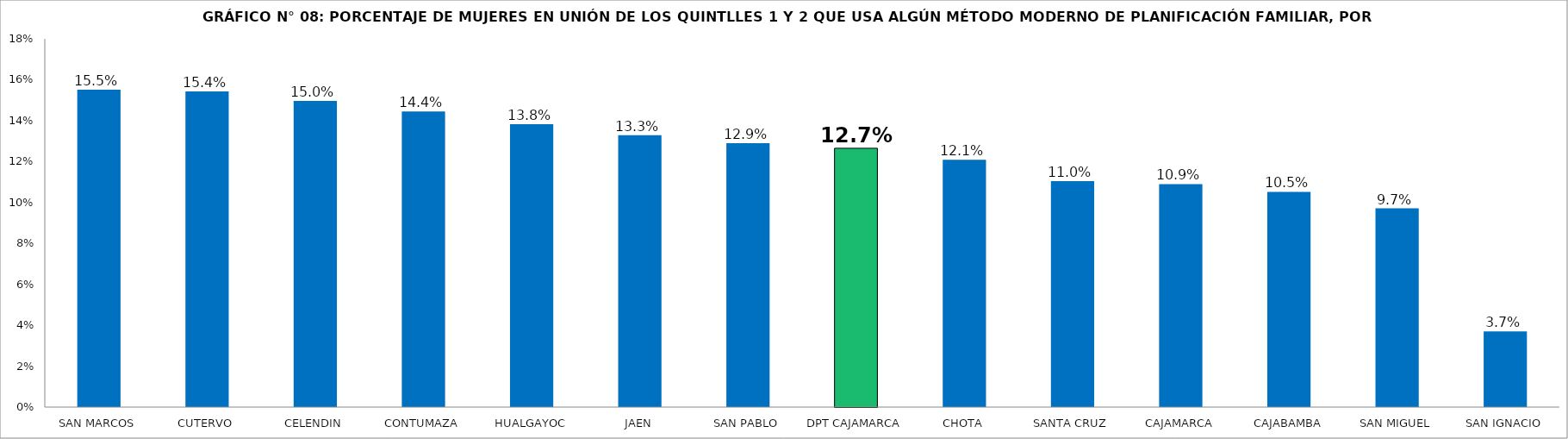
| Category | Series 0 |
|---|---|
| SAN MARCOS | 0.155 |
| CUTERVO | 0.154 |
| CELENDIN | 0.15 |
| CONTUMAZA | 0.144 |
| HUALGAYOC | 0.138 |
| JAEN | 0.133 |
| SAN PABLO | 0.129 |
| DPT CAJAMARCA | 0.127 |
| CHOTA | 0.121 |
| SANTA CRUZ | 0.11 |
| CAJAMARCA | 0.109 |
| CAJABAMBA | 0.105 |
| SAN MIGUEL | 0.097 |
| SAN IGNACIO | 0.037 |